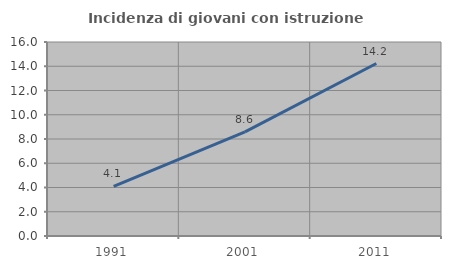
| Category | Incidenza di giovani con istruzione universitaria |
|---|---|
| 1991.0 | 4.1 |
| 2001.0 | 8.594 |
| 2011.0 | 14.224 |